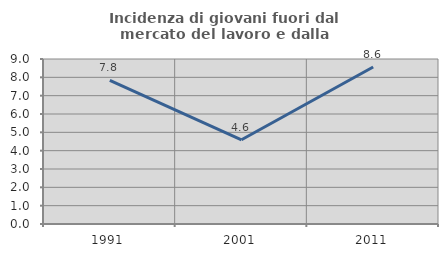
| Category | Incidenza di giovani fuori dal mercato del lavoro e dalla formazione  |
|---|---|
| 1991.0 | 7.828 |
| 2001.0 | 4.594 |
| 2011.0 | 8.56 |